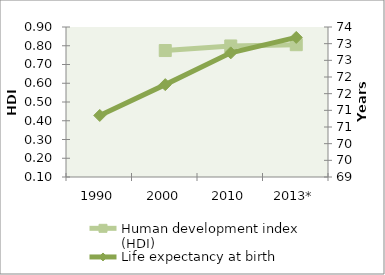
| Category | Human development index (HDI) |
|---|---|
| 1990 | 0 |
| 2000 | 0.774 |
| 2010 | 0.799 |
| 2013* | 0.806 |